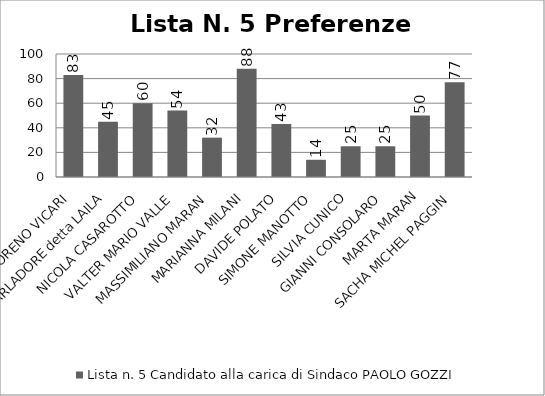
| Category | Lista n. 5 Candidato alla carica di Sindaco PAOLO GOZZI |
|---|---|
| MORENO VICARI | 83 |
| CHIARA PARLADORE detta LAILA | 45 |
| NICOLA CASAROTTO | 60 |
| VALTER MARIO VALLE | 54 |
| MASSIMILIANO MARAN | 32 |
| MARIANNA MILANI | 88 |
| DAVIDE POLATO | 43 |
| SIMONE MANOTTO | 14 |
| SILVIA CUNICO | 25 |
| GIANNI CONSOLARO | 25 |
| MARTA MARAN | 50 |
| SACHA MICHEL PAGGIN | 77 |